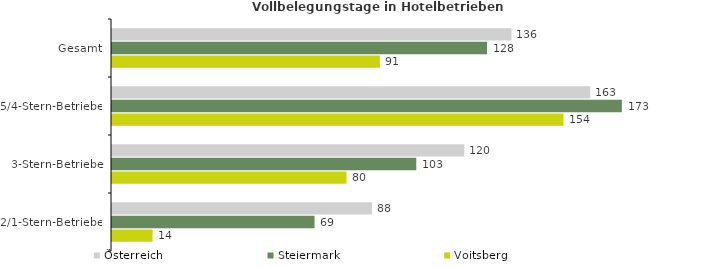
| Category | Österreich | Steiermark | Voitsberg |
|---|---|---|---|
| Gesamt | 135.866 | 127.561 | 91.098 |
| 5/4-Stern-Betriebe | 162.683 | 173.435 | 153.562 |
| 3-Stern-Betriebe | 119.851 | 103.499 | 79.762 |
| 2/1-Stern-Betriebe | 88.435 | 68.894 | 13.798 |